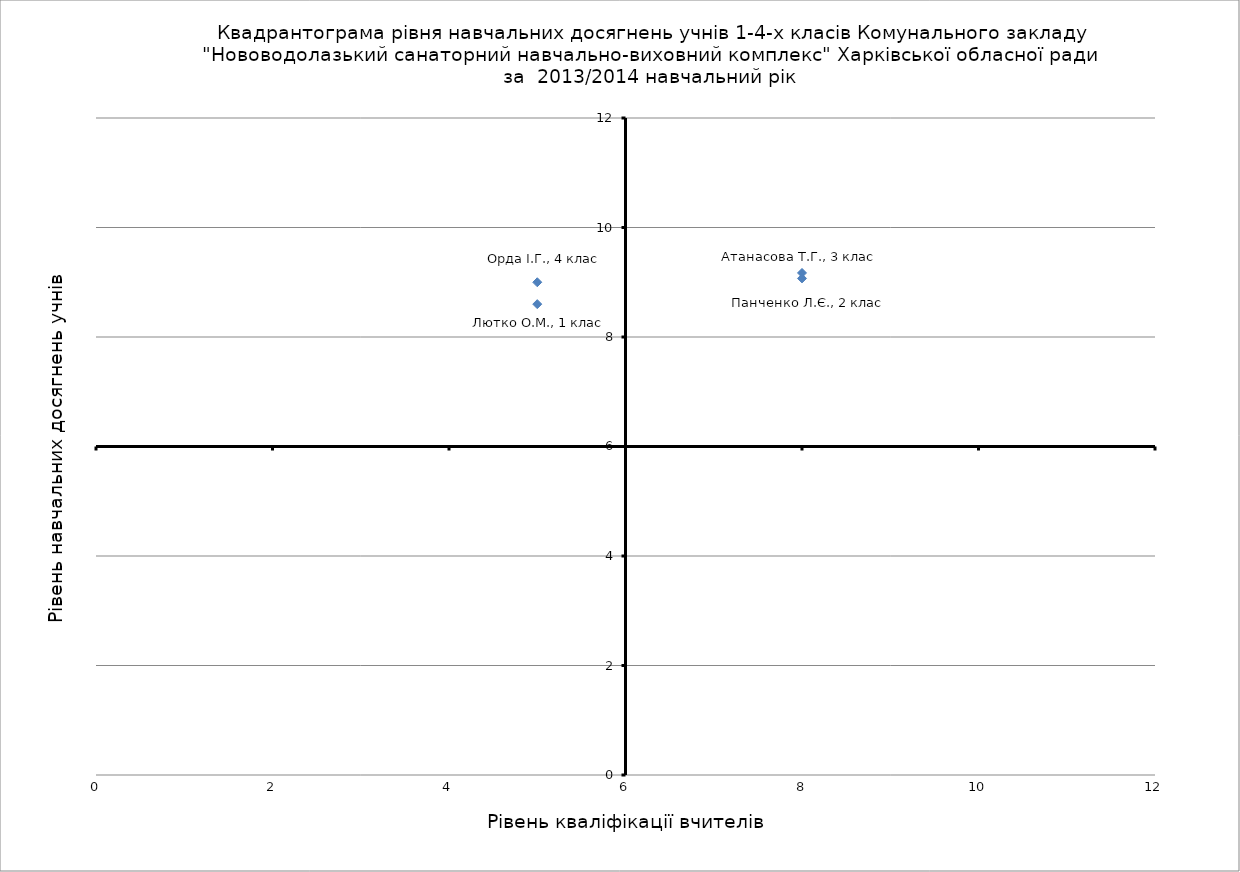
| Category | Рівень навчальних досягнень учнів |
|---|---|
| 5.0 | 8.6 |
| 8.0 | 9.07 |
| 8.0 | 9.17 |
| 5.0 | 9 |